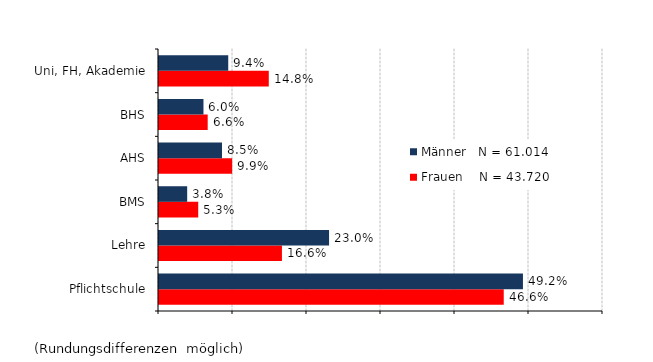
| Category | Frauen    N = 43.720 | Männer   N = 61.014 |
|---|---|---|
| Pflichtschule | 0.466 | 0.492 |
| Lehre | 0.166 | 0.23 |
| BMS | 0.053 | 0.038 |
| AHS | 0.099 | 0.085 |
| BHS | 0.066 | 0.06 |
| Uni, FH, Akademie | 0.148 | 0.094 |